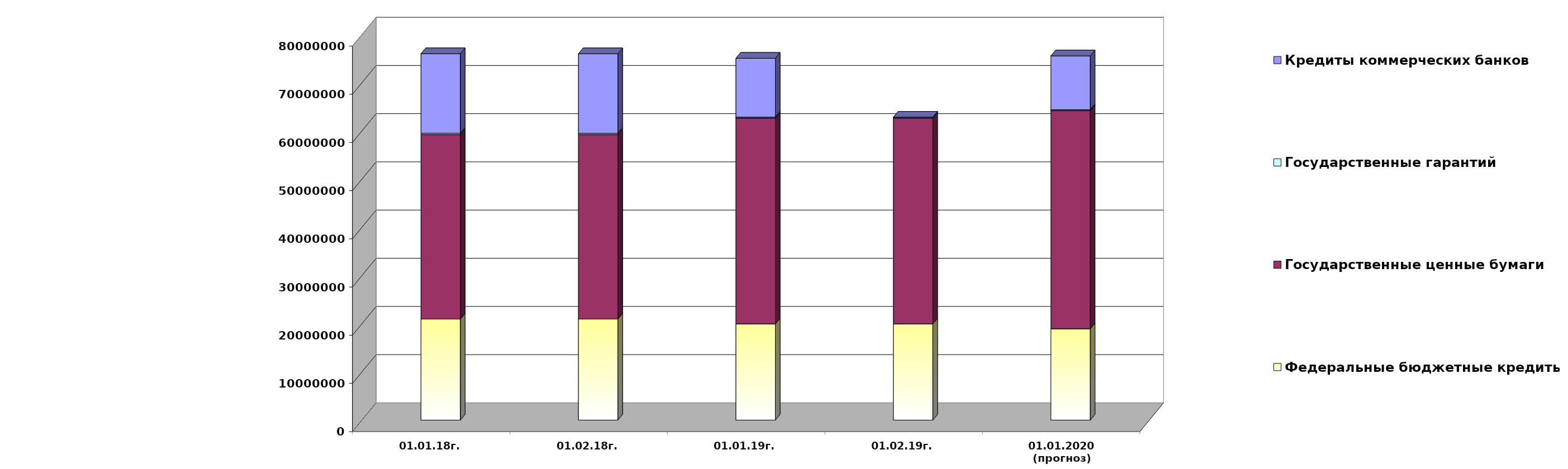
| Category | Федеральные бюджетные кредиты | Государственные ценные бумаги  | Государственные гарантий | Кредиты коммерческих банков |
|---|---|---|---|---|
| 01.01.18г. | 20959084.963 | 38300000 | 267412.82 | 16500000 |
| 01.02.18г. | 20959084.963 | 38300000 | 262100.52 | 16500000 |
| 01.01.19г. | 19957026.213 | 42700000 | 209872.86 | 12219963.75 |
| 01.02.19г. | 19957026.213 | 42700000 | 200735.86 | 0 |
| 01.01.2020
(прогноз) | 18954967.4 | 45300000 | 155129.9 | 11164746.4 |